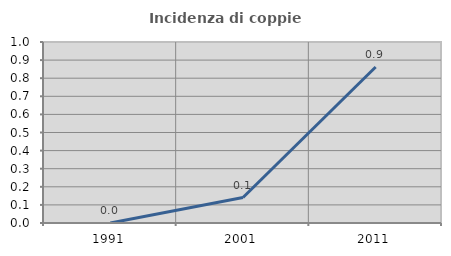
| Category | Incidenza di coppie miste |
|---|---|
| 1991.0 | 0 |
| 2001.0 | 0.141 |
| 2011.0 | 0.862 |